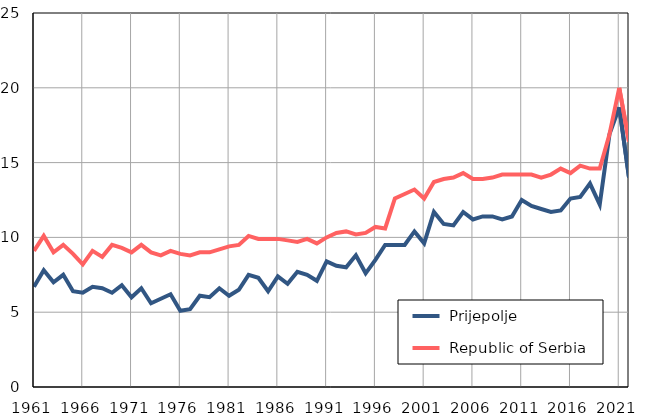
| Category |  Prijepolje |  Republic of Serbia |
|---|---|---|
| 1961.0 | 6.7 | 9.1 |
| 1962.0 | 7.8 | 10.1 |
| 1963.0 | 7 | 9 |
| 1964.0 | 7.5 | 9.5 |
| 1965.0 | 6.4 | 8.9 |
| 1966.0 | 6.3 | 8.2 |
| 1967.0 | 6.7 | 9.1 |
| 1968.0 | 6.6 | 8.7 |
| 1969.0 | 6.3 | 9.5 |
| 1970.0 | 6.8 | 9.3 |
| 1971.0 | 6 | 9 |
| 1972.0 | 6.6 | 9.5 |
| 1973.0 | 5.6 | 9 |
| 1974.0 | 5.9 | 8.8 |
| 1975.0 | 6.2 | 9.1 |
| 1976.0 | 5.1 | 8.9 |
| 1977.0 | 5.2 | 8.8 |
| 1978.0 | 6.1 | 9 |
| 1979.0 | 6 | 9 |
| 1980.0 | 6.6 | 9.2 |
| 1981.0 | 6.1 | 9.4 |
| 1982.0 | 6.5 | 9.5 |
| 1983.0 | 7.5 | 10.1 |
| 1984.0 | 7.3 | 9.9 |
| 1985.0 | 6.4 | 9.9 |
| 1986.0 | 7.4 | 9.9 |
| 1987.0 | 6.9 | 9.8 |
| 1988.0 | 7.7 | 9.7 |
| 1989.0 | 7.5 | 9.9 |
| 1990.0 | 7.1 | 9.6 |
| 1991.0 | 8.4 | 10 |
| 1992.0 | 8.1 | 10.3 |
| 1993.0 | 8 | 10.4 |
| 1994.0 | 8.8 | 10.2 |
| 1995.0 | 7.6 | 10.3 |
| 1996.0 | 8.5 | 10.7 |
| 1997.0 | 9.5 | 10.6 |
| 1998.0 | 9.5 | 12.6 |
| 1999.0 | 9.5 | 12.9 |
| 2000.0 | 10.4 | 13.2 |
| 2001.0 | 9.6 | 12.6 |
| 2002.0 | 11.7 | 13.7 |
| 2003.0 | 10.9 | 13.9 |
| 2004.0 | 10.8 | 14 |
| 2005.0 | 11.7 | 14.3 |
| 2006.0 | 11.2 | 13.9 |
| 2007.0 | 11.4 | 13.9 |
| 2008.0 | 11.4 | 14 |
| 2009.0 | 11.2 | 14.2 |
| 2010.0 | 11.4 | 14.2 |
| 2011.0 | 12.5 | 14.2 |
| 2012.0 | 12.1 | 14.2 |
| 2013.0 | 11.9 | 14 |
| 2014.0 | 11.7 | 14.2 |
| 2015.0 | 11.8 | 14.6 |
| 2016.0 | 12.6 | 14.3 |
| 2017.0 | 12.7 | 14.8 |
| 2018.0 | 13.6 | 14.6 |
| 2019.0 | 12.2 | 14.6 |
| 2020.0 | 16.9 | 16.9 |
| 2021.0 | 18.7 | 20 |
| 2022.0 | 14 | 16.4 |